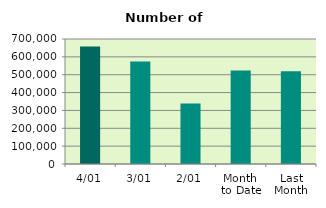
| Category | Series 0 |
|---|---|
| 4/01 | 657904 |
| 3/01 | 573682 |
| 2/01 | 338460 |
| Month 
to Date | 523348.667 |
| Last
Month | 519611.714 |